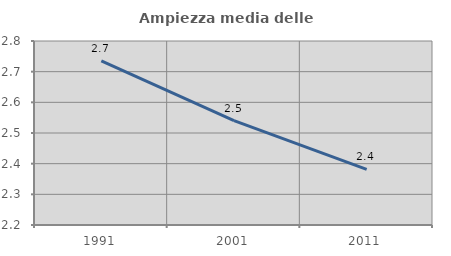
| Category | Ampiezza media delle famiglie |
|---|---|
| 1991.0 | 2.735 |
| 2001.0 | 2.54 |
| 2011.0 | 2.381 |